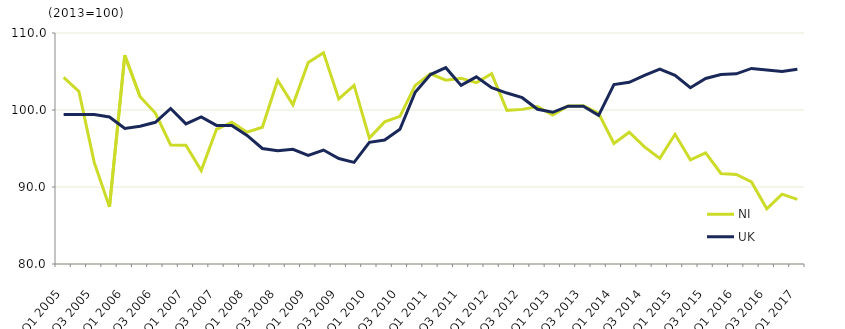
| Category | NI  | UK  |
|---|---|---|
| Q1 2005 | 104.226 | 99.4 |
| Q2 2005 | 102.401 | 99.4 |
| Q3 2005 | 93.196 | 99.4 |
| Q4 2005 | 87.413 | 99.1 |
| Q1 2006 | 107.124 | 97.6 |
| Q2 2006 | 101.716 | 97.9 |
| Q3 2006 | 99.604 | 98.4 |
| Q4 2006 | 95.456 | 100.2 |
| Q1 2007 | 95.436 | 98.2 |
| Q2 2007 | 92.128 | 99.1 |
| Q3 2007 | 97.496 | 98 |
| Q4 2007 | 98.408 | 98 |
| Q1 2008 | 97.12 | 96.7 |
| Q2 2008 | 97.753 | 95 |
| Q3 2008 | 103.866 | 94.7 |
| Q4 2008 | 100.673 | 94.9 |
| Q1 2009 | 106.183 | 94.1 |
| Q2 2009 | 107.441 | 94.8 |
| Q3 2009 | 101.441 | 93.7 |
| Q4 2009 | 103.19 | 93.2 |
| Q1 2010 | 96.35 | 95.8 |
| Q2 2010 | 98.453 | 96.1 |
| Q3 2010 | 99.168 | 97.5 |
| Q4 2010 | 103.194 | 102.3 |
| Q1 2011 | 104.706 | 104.6 |
| Q2 2011 | 103.868 | 105.5 |
| Q3 2011 | 104.128 | 103.2 |
| Q4 2011 | 103.546 | 104.3 |
| Q1 2012 | 104.726 | 102.9 |
| Q2 2012 | 99.956 | 102.2 |
| Q3 2012 | 100.081 | 101.6 |
| Q4 2012 | 100.439 | 100.1 |
| Q1 2013 | 99.348 | 99.7 |
| Q2 2013 | 100.529 | 100.5 |
| Q3 2013 | 100.562 | 100.5 |
| Q4 2013 | 99.561 | 99.3 |
| Q1 2014 | 95.651 | 103.3 |
| Q2 2014 | 97.113 | 103.6 |
| Q3 2014 | 95.204 | 104.5 |
| Q4 2014 | 93.715 | 105.3 |
| Q1 2015 | 96.846 | 104.5 |
| Q2 2015 | 93.534 | 102.9 |
| Q3 2015 | 94.435 | 104.1 |
| Q4 2015 | 91.758 | 104.6 |
| Q1 2016 | 91.629 | 104.7 |
| Q2 2016 | 90.657 | 105.4 |
| Q3 2016 | 87.178 | 105.2 |
| Q4 2016 | 89.074 | 105 |
| Q1 2017 | 88.395 | 105.3 |